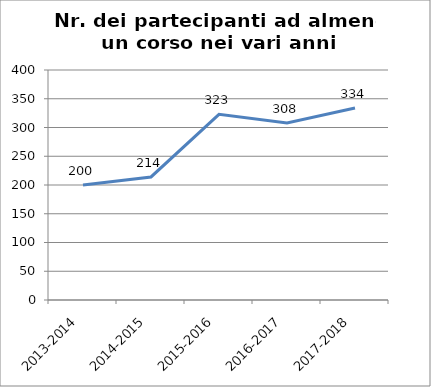
| Category | Nr. Partecipanti ad almeno un Corso |
|---|---|
| 2013-2014 | 200 |
| 2014-2015 | 214 |
| 2015-2016 | 323 |
| 2016-2017 | 308 |
| 2017-2018 | 334 |